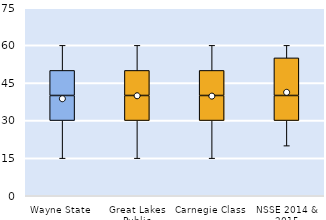
| Category | 25th | 50th | 75th |
|---|---|---|---|
| Wayne State | 30 | 10 | 10 |
| Great Lakes Public | 30 | 10 | 10 |
| Carnegie Class | 30 | 10 | 10 |
| NSSE 2014 & 2015 | 30 | 10 | 15 |